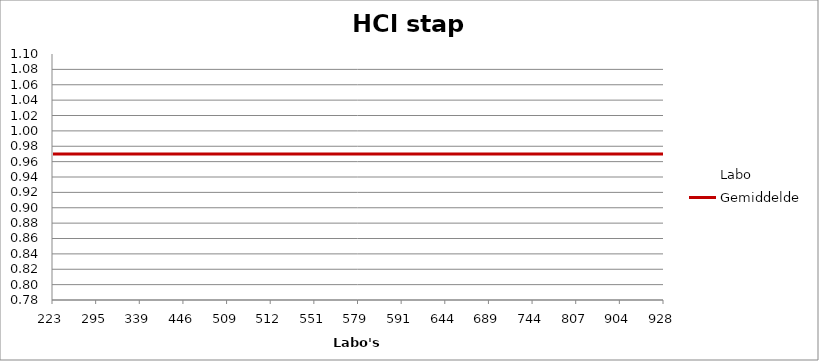
| Category | Labo | Gemiddelde |
|---|---|---|
| 223.0 | 1.002 | 0.97 |
| 295.0 | 1.077 | 0.97 |
| 339.0 | 0.945 | 0.97 |
| 446.0 | 1 | 0.97 |
| 509.0 | 0.934 | 0.97 |
| 512.0 | 0.945 | 0.97 |
| 551.0 | 0.879 | 0.97 |
| 579.0 | 0.952 | 0.97 |
| 591.0 | 0.978 | 0.97 |
| 644.0 | 0.97 | 0.97 |
| 689.0 | 2.025 | 0.97 |
| 744.0 | 0.948 | 0.97 |
| 807.0 | 0.798 | 0.97 |
| 904.0 | 0.952 | 0.97 |
| 928.0 | 0.945 | 0.97 |